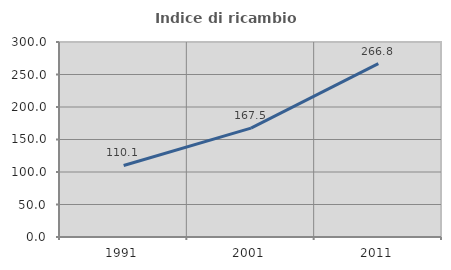
| Category | Indice di ricambio occupazionale  |
|---|---|
| 1991.0 | 110.096 |
| 2001.0 | 167.529 |
| 2011.0 | 266.766 |